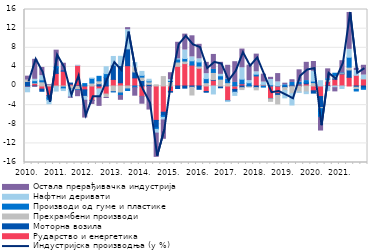
| Category | Рударство и енергетика | Моторна возила | Прехрамбени производи | Производи од гуме и пластике | Нафтни деривати | Остала прерађивачка индустрија |
|---|---|---|---|---|---|---|
| 2010.  | -0.248 | 0.945 | 0.274 | -0.044 | -0.918 | 0.842 |
| II  | 0.544 | -0.005 | 0.123 | 0.444 | 0.281 | 4.19 |
| III | -0.651 | -0.452 | 0.873 | 0.423 | 0.867 | 1.718 |
| IV | -1.98 | -0.567 | 0.135 | -0.462 | -0.713 | 0.166 |
| 2011.  | 2.638 | 1.179 | -0.154 | 0.257 | -0.906 | 3.421 |
| II | 3.098 | 0.125 | -0.232 | -0.357 | -0.369 | 1.537 |
| III | 0.39 | 0.224 | -0.676 | -0.033 | -1.607 | -0.231 |
| IV | 4.306 | -0.098 | -0.671 | -0.138 | 0.009 | -1.33 |
| 2012. | -0.807 | -1.366 | -0.068 | 0.501 | -0.734 | -3.73 |
| II | -2.99 | -0.036 | 0.622 | 0.973 | 0.015 | -0.833 |
| III | -0.598 | 0.473 | 0.605 | 0.948 | -1.69 | -1.976 |
| IV | -1.686 | 1.82 | -0.709 | 0.774 | 1.43 | -0.219 |
| 2013. | 1.387 | 2.988 | -1.171 | -0.072 | 1.806 | -0.039 |
| II | 0.676 | 3.614 | -1.461 | -0.522 | 1.918 | -1.008 |
| III | 4.247 | 3.522 | -0.613 | -0.326 | 3.996 | 0.438 |
| IV | 1.699 | 1.24 | 1.077 | -0.344 | 0.887 | -1.58 |
| 2014. | -2.158 | 1.145 | 0.711 | 0.374 | 0.825 | -1.65 |
| II | -0.117 | 0.352 | 0.505 | 0.206 | 0.356 | -4.913 |
| III | -7.196 | -1.556 | 0.248 | -0.322 | -0.778 | -5.071 |
| IV | -5.482 | -0.701 | 1.976 | -0.383 | -0.54 | -4.041 |
| 2015. | -1.16 | -0.127 | 0.946 | 0.2 | 0.205 | 1.426 |
| II | 4.118 | -0.523 | 0.906 | 0.614 | 0.052 | 3.453 |
| III | 4.684 | -0.448 | 0.536 | 0.527 | 1.77 | 3.333 |
| IV | 4.383 | -0.269 | -1.617 | 0.885 | 0.812 | 4.418 |
| 2016. | 3.713 | -0.69 | 0.463 | 0.854 | 0.644 | 3.048 |
| II | -1.146 | -0.157 | 0.691 | 0.854 | 1.023 | 2.38 |
| III | 1.203 | 0.131 | 1.504 | 0.626 | -1.665 | 3.137 |
| IV | -0.136 | -0.235 | 1.435 | 0.709 | 0.289 | 2.52 |
| 2017. | -3.018 | -0.057 | 0.695 | 0.724 | -0.175 | 2.912 |
| II | -0.711 | -0.598 | 0.034 | 0.705 | -0.657 | 4.345 |
| III | 0.471 | -0.354 | -0.396 | 0.956 | 2.373 | 3.925 |
| IV | -0.06 | 0.021 | -0.152 | 0.648 | 0.446 | 3.245 |
| 2018. | 2.107 | -0.337 | -0.466 | 0.365 | 0.478 | 3.717 |
| II | 0.306 | 0.016 | -0.041 | -0.191 | 0.493 | 1.66 |
| III | -2.648 | -0.033 | -0.528 | 0.243 | 1.122 | 0.451 |
| IV | -1.596 | -0.365 | -1.784 | 0.055 | 0.793 | 1.75 |
| 2019. | -0.083 | -0.248 | -0.643 | 0.253 | -1.505 | 0.337 |
| II | 0.19 | -0.134 | -1.476 | 0.548 | -2.365 | 0.575 |
| III | 0.405 | -0.049 | -1.196 | 0.41 | -0.092 | 2.569 |
| IV | 0.469 | 0.228 | -1.239 | 0.433 | -0.36 | 3.822 |
| 2020. | -1.009 | -0.48 | 0.709 | 0.313 | 2.052 | 2.048 |
| II | -2.206 | -2.299 | -0.233 | -1.816 | 1.108 | -2.862 |
| III | 0.937 | -0.112 | 0.487 | 0.1 | -0.843 | 2.063 |
| IV | 1.429 | 0.25 | 0.503 | 0.489 | -0.36 | -0.87 |
| 2021. | 2.533 | 0.046 | 0.172 | 0.015 | -0.526 | 2.527 |
| II | 1.827 | 1.526 | 0.588 | 2.079 | 1.641 | 7.712 |
| III | 2.231 | -0.252 | -0.468 | -0.324 | 0.996 | 0.49 |
| IV | 1.506 | -0.414 | 0.013 | -0.276 | 0.761 | 2.056 |